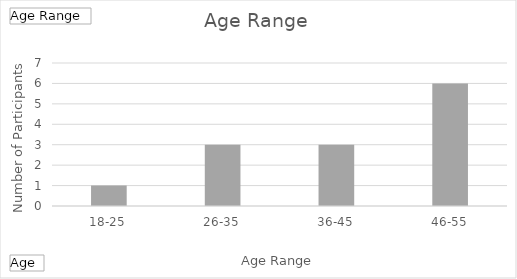
| Category | Total |
|---|---|
| 18-25 | 1 |
| 26-35 | 3 |
| 36-45 | 3 |
| 46-55 | 6 |